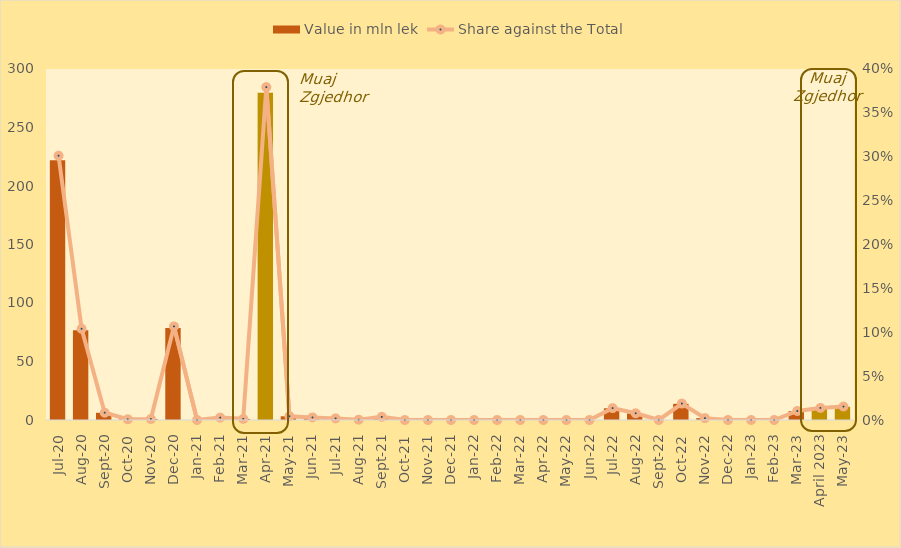
| Category | Value in mln lek |
|---|---|
| Jul-20 | 222.05 |
| Aug-20 | 76.65 |
| Sep-20 | 6.15 |
| Oct-20 | 0.6 |
| Nov-20 | 0.85 |
| Dec-20 | 78.65 |
| Jan-21 | 0 |
| Feb-21 | 2 |
| Mar-21 | 0.95 |
| Apr-21 | 279.679 |
| May-21 | 3.155 |
| Jun-21 | 2.155 |
| Jul-21 | 1.342 |
| Aug-21 | 0.25 |
| Sep-21 | 2.655 |
| Oct-21 | 0 |
| Nov-21 | 0 |
| Dec-21 | 0 |
| Jan-22 | 0 |
| Feb-22 | 0 |
| Mar-22 | 0 |
| Apr-22 | 0 |
| May-22 | 0 |
| Jun-22 | 0 |
| Jul-22 | 9.986 |
| Aug-22 | 5.651 |
| Sep-22 | 0 |
| Oct-22 | 13.821 |
| Nov-22 | 1.568 |
| Dec-22 | 0 |
| Jan-23 | 0 |
| Feb-23 | 0 |
| Mar-23 | 7.57 |
| April 2023 | 10.159 |
| May-23 | 11.3 |